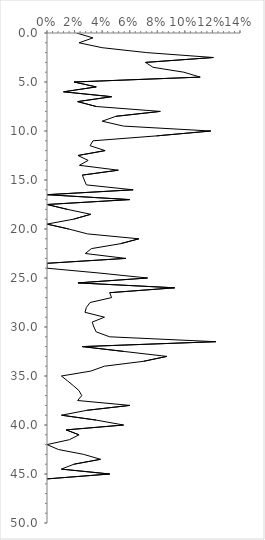
| Category | Series 0 |
|---|---|
| 0.0213903743315508 | 0 |
| 0.03333333333333333 | 0.5 |
| 0.023255813953488372 | 1 |
| 0.04 | 1.5 |
| 0.07228915662650602 | 2 |
| 0.1206896551724138 | 2.5 |
| 0.07142857142857142 | 3 |
| 0.07692307692307693 | 3.5 |
| 0.09923664122137404 | 4 |
| 0.1111111111111111 | 4.5 |
| 0.0196078431372549 | 5 |
| 0.03571428571428571 | 5.5 |
| 0.012048192771084338 | 6 |
| 0.046875 | 6.5 |
| 0.022222222222222223 | 7 |
| 0.03571428571428571 | 7.5 |
| 0.0821917808219178 | 8 |
| 0.05 | 8.5 |
| 0.04 | 9 |
| 0.05555555555555555 | 9.5 |
| 0.1188118811881188 | 10 |
| 0.07936507936507936 | 10.5 |
| 0.03333333333333333 | 11 |
| 0.03125 | 11.5 |
| 0.04216867469879518 | 12 |
| 0.02247191011235955 | 12.5 |
| 0.029850746268656716 | 13 |
| 0.023529411764705882 | 13.5 |
| 0.05172413793103448 | 14 |
| 0.02564102564102564 | 14.5 |
| 0.02702702702702703 | 15 |
| 0.02857142857142857 | 15.5 |
| 0.0625 | 16 |
| 0.0 | 16.5 |
| 0.06 | 17 |
| 0.0 | 17.5 |
| 0.014925373134328358 | 18 |
| 0.031746031746031744 | 18.5 |
| 0.019230769230769232 | 19 |
| 0.0 | 19.5 |
| 0.015748031496062992 | 20 |
| 0.029411764705882353 | 20.5 |
| 0.06666666666666667 | 21 |
| 0.05333333333333334 | 21.5 |
| 0.03225806451612903 | 22 |
| 0.027777777777777776 | 22.5 |
| 0.05714285714285714 | 23 |
| 0.0 | 23.5 |
| 0.0 | 24 |
| 0.038461538461538464 | 24.5 |
| 0.07291666666666667 | 25 |
| 0.02247191011235955 | 25.5 |
| 0.09259259259259259 | 26 |
| 0.045454545454545456 | 26.5 |
| 0.046875 | 27 |
| 0.03125 | 27.5 |
| 0.02857142857142857 | 28 |
| 0.027586206896551724 | 28.5 |
| 0.041666666666666664 | 29 |
| 0.03278688524590164 | 29.5 |
| 0.034013605442176874 | 30 |
| 0.03571428571428571 | 30.5 |
| 0.045454545454545456 | 31 |
| 0.12244897959183673 | 31.5 |
| 0.02564102564102564 | 32 |
| 0.056179775280898875 | 32.5 |
| 0.08695652173913043 | 33 |
| 0.07 | 33.5 |
| 0.041666666666666664 | 34 |
| 0.031746031746031744 | 34.5 |
| 0.010416666666666666 | 35 |
| 0.014925373134328358 | 35.5 |
| 0.019230769230769232 | 36 |
| 0.023255813953488372 | 36.5 |
| 0.025210084033613446 | 37 |
| 0.022222222222222223 | 37.5 |
| 0.06015037593984962 | 38 |
| 0.028985507246376812 | 38.5 |
| 0.010526315789473684 | 39 |
| 0.03571428571428571 | 39.5 |
| 0.05555555555555555 | 40 |
| 0.013888888888888888 | 40.5 |
| 0.023255813953488372 | 41 |
| 0.016260162601626018 | 41.5 |
| 0.0 | 42 |
| 0.008264462809917356 | 42.5 |
| 0.02666666666666667 | 43 |
| 0.038834951456310676 | 43.5 |
| 0.0196078431372549 | 44 |
| 0.010416666666666666 | 44.5 |
| 0.045454545454545456 | 45 |
| 0.0 | 45.5 |